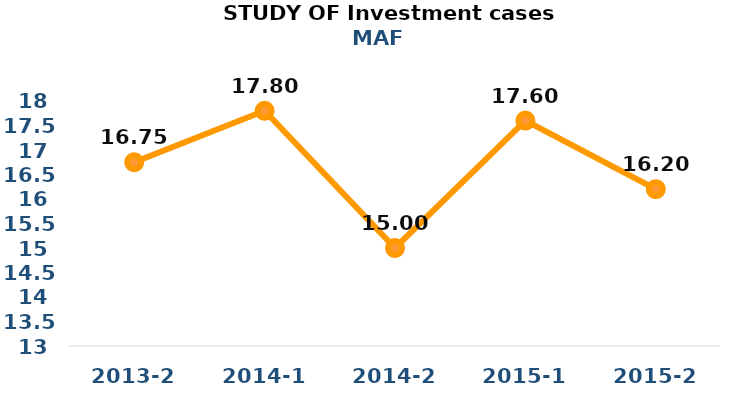
| Category | Series 0 |
|---|---|
| 2013-2 | 16.75 |
| 2014-1 | 17.8 |
| 2014-2 | 15 |
| 2015-1 | 17.6 |
| 2015-2 | 16.2 |